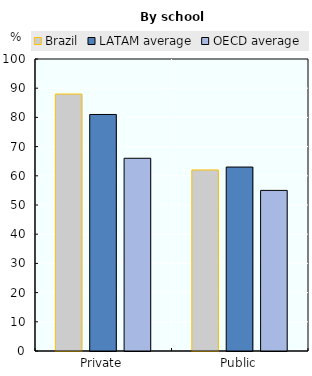
| Category | Brazil | LATAM average | OECD average |
|---|---|---|---|
| Private | 88 | 81 | 66 |
| Public | 62 | 63 | 55 |